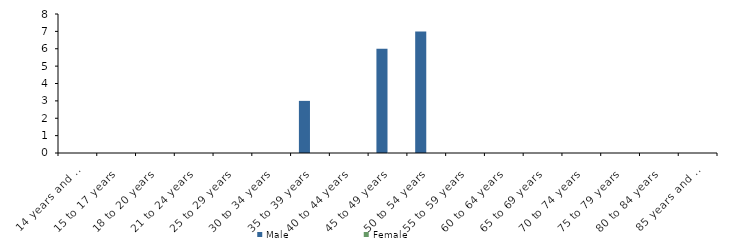
| Category | Male | Female |
|---|---|---|
| 14 years and under | 0 | 0 |
| 15 to 17 years | 0 | 0 |
| 18 to 20 years | 0 | 0 |
| 21 to 24 years | 0 | 0 |
| 25 to 29 years | 0 | 0 |
| 30 to 34 years | 0 | 0 |
| 35 to 39 years | 3 | 0 |
| 40 to 44 years | 0 | 0 |
| 45 to 49 years | 6 | 0 |
| 50 to 54 years | 7 | 0 |
| 55 to 59 years | 0 | 0 |
| 60 to 64 years | 0 | 0 |
| 65 to 69 years | 0 | 0 |
| 70 to 74 years | 0 | 0 |
| 75 to 79 years | 0 | 0 |
| 80 to 84 years | 0 | 0 |
| 85 years and over | 0 | 0 |